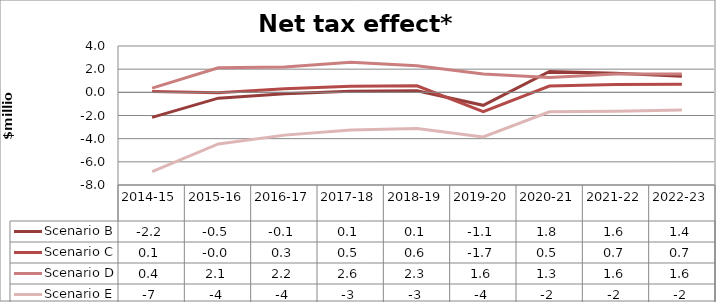
| Category | Scenario B | Scenario C | Scenario D | Scenario E |
|---|---|---|---|---|
| 2014-15 | -2.163 | 0.073 | 0.368 | -6.842 |
| 2015-16 | -0.503 | -0.046 | 2.118 | -4.453 |
| 2016-17 | -0.115 | 0.306 | 2.188 | -3.694 |
| 2017-18 | 0.091 | 0.524 | 2.6 | -3.26 |
| 2018-19 | 0.139 | 0.569 | 2.292 | -3.131 |
| 2019-20 | -1.12 | -1.676 | 1.578 | -3.847 |
| 2020-21 | 1.801 | 0.546 | 1.28 | -1.687 |
| 2021-22 | 1.637 | 0.679 | 1.588 | -1.629 |
| 2022-23 | 1.379 | 0.701 | 1.584 | -1.518 |